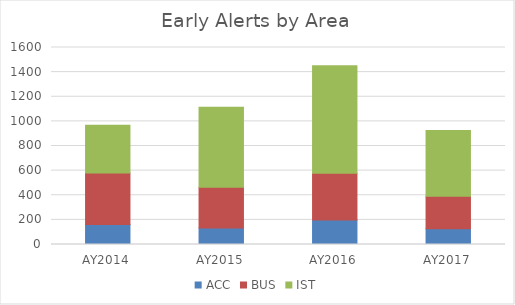
| Category | ACC | BUS | IST |
|---|---|---|---|
| AY2014 | 163 | 417 | 388 |
| AY2015 | 134 | 330 | 651 |
| AY2016 | 199 | 379 | 873 |
| AY2017 | 127 | 265 | 533 |